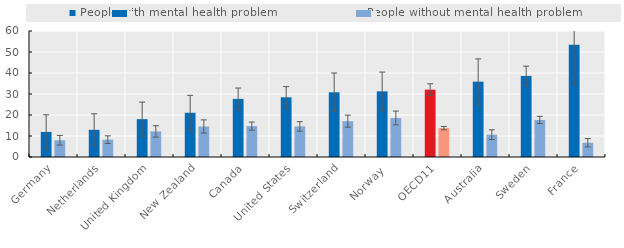
| Category | People with mental health problem | People without mental health problem |
|---|---|---|
| Germany | 11.938 | 7.972 |
| Netherlands | 12.95 | 8.265 |
| United Kingdom | 18.023 | 12.175 |
| New Zealand | 21.064 | 14.541 |
| Canada | 27.664 | 14.71 |
| United States | 28.421 | 14.571 |
| Switzerland | 30.82 | 17.061 |
| Norway  | 31.263 | 18.58 |
| OECD11 | 32.075 | 13.756 |
| Australia | 35.888 | 10.639 |
| Sweden | 38.607 | 17.677 |
| France | 53.512 | 6.787 |